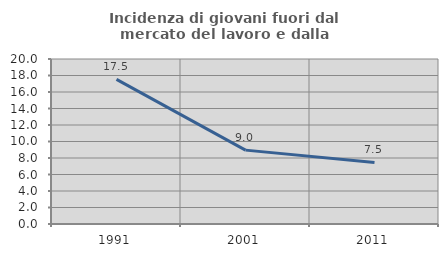
| Category | Incidenza di giovani fuori dal mercato del lavoro e dalla formazione  |
|---|---|
| 1991.0 | 17.526 |
| 2001.0 | 8.955 |
| 2011.0 | 7.463 |